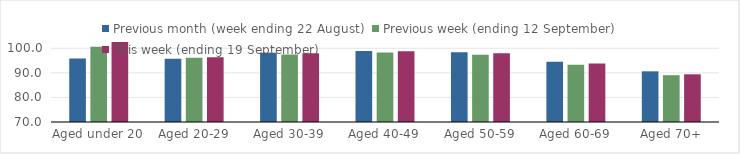
| Category | Previous month (week ending 22 August) | Previous week (ending 12 September) | This week (ending 19 September) |
|---|---|---|---|
| Aged under 20 | 95.82 | 100.64 | 102.59 |
| Aged 20-29 | 95.7 | 96.12 | 96.4 |
| Aged 30-39 | 98.15 | 97.48 | 97.96 |
| Aged 40-49 | 98.94 | 98.25 | 98.83 |
| Aged 50-59 | 98.39 | 97.42 | 97.95 |
| Aged 60-69 | 94.53 | 93.25 | 93.8 |
| Aged 70+ | 90.62 | 89.05 | 89.41 |